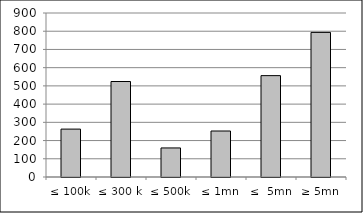
| Category | Series 0 |
|---|---|
| ≤ 100k | 262835590.84 |
| ≤ 300 k | 524056602.717 |
| ≤ 500k | 159467867.427 |
| ≤ 1mn | 252426075.569 |
| ≤  5mn | 556309081.8 |
| ≥ 5mn | 793527591.57 |